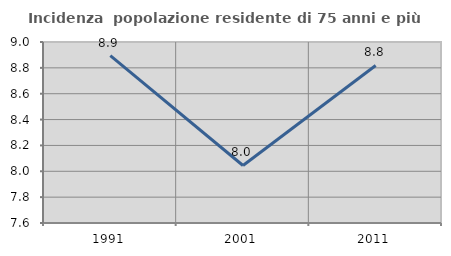
| Category | Incidenza  popolazione residente di 75 anni e più |
|---|---|
| 1991.0 | 8.895 |
| 2001.0 | 8.045 |
| 2011.0 | 8.818 |